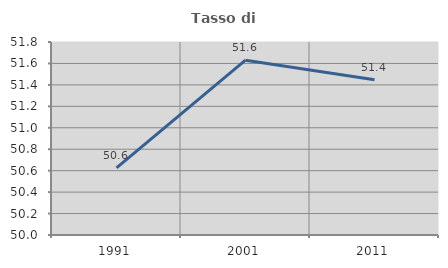
| Category | Tasso di occupazione   |
|---|---|
| 1991.0 | 50.626 |
| 2001.0 | 51.63 |
| 2011.0 | 51.447 |